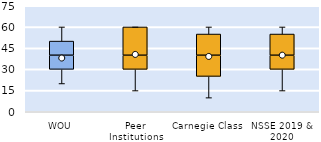
| Category | 25th | 50th | 75th |
|---|---|---|---|
| WOU | 30 | 10 | 10 |
| Peer Institutions | 30 | 10 | 20 |
| Carnegie Class | 25 | 15 | 15 |
| NSSE 2019 & 2020 | 30 | 10 | 15 |